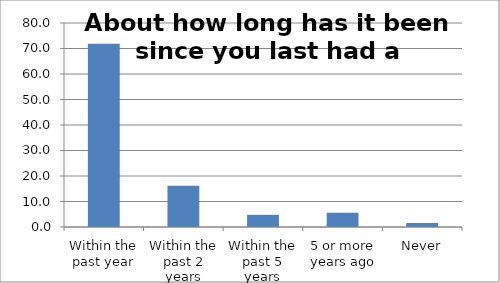
| Category | Series 0 |
|---|---|
| Within the past year | 71.906 |
| Within the past 2 years | 16.166 |
| Within the past 5 years | 4.772 |
| 5 or more years ago | 5.558 |
| Never | 1.598 |